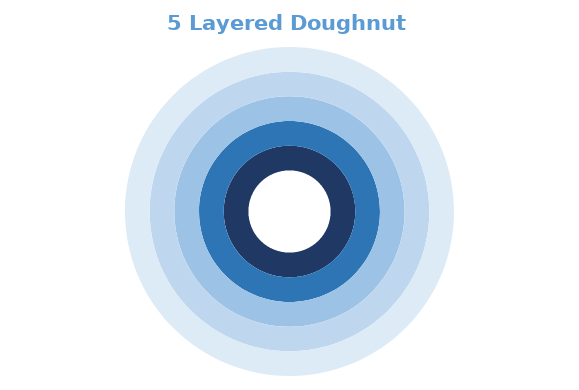
| Category | 5 | 4 | 3 | 2 | 1 |
|---|---|---|---|---|---|
| 0 | 1 | 1 | 1 | 1 | 1 |
| 1 | 0 | 0 | 0 | 0 | 0 |